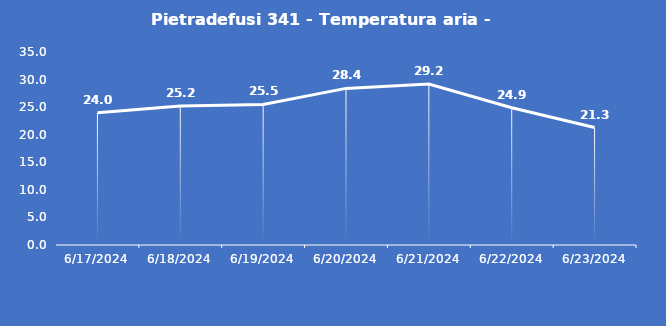
| Category | Pietradefusi 341 - Temperatura aria - Grezzo (°C) |
|---|---|
| 6/17/24 | 24 |
| 6/18/24 | 25.2 |
| 6/19/24 | 25.5 |
| 6/20/24 | 28.4 |
| 6/21/24 | 29.2 |
| 6/22/24 | 24.9 |
| 6/23/24 | 21.3 |